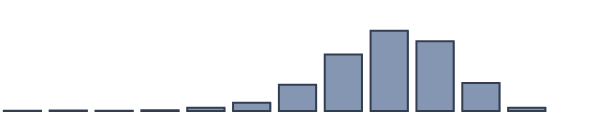
| Category | Series 0 |
|---|---|
| 0 | 0.087 |
| 1 | 0.217 |
| 2 | 0.13 |
| 3 | 0.304 |
| 4 | 1.13 |
| 5 | 2.957 |
| 6 | 9.435 |
| 7 | 20.391 |
| 8 | 28.957 |
| 9 | 25.13 |
| 10 | 10.087 |
| 11 | 1.174 |
| 12 | 0 |